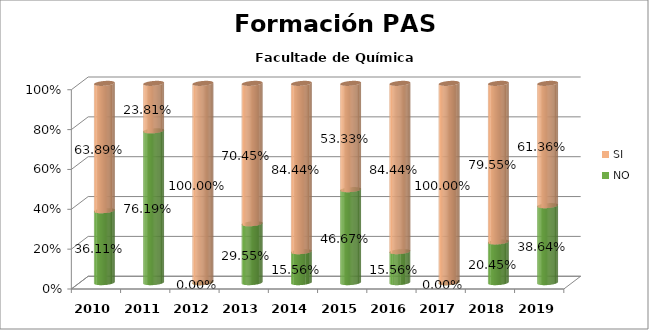
| Category | NO | SI |
|---|---|---|
| 2010.0 | 0.361 | 0.639 |
| 2011.0 | 0.762 | 0.238 |
| 2012.0 | 0 | 1 |
| 2013.0 | 0.295 | 0.705 |
| 2014.0 | 0.156 | 0.844 |
| 2015.0 | 0.467 | 0.533 |
| 2016.0 | 0.156 | 0.844 |
| 2017.0 | 0 | 1 |
| 2018.0 | 0.205 | 0.796 |
| 2019.0 | 0.386 | 0.614 |